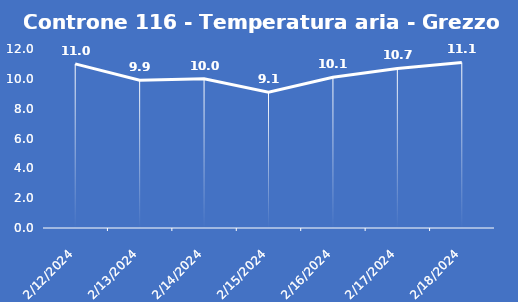
| Category | Controne 116 - Temperatura aria - Grezzo (°C) |
|---|---|
| 2/12/24 | 11 |
| 2/13/24 | 9.9 |
| 2/14/24 | 10 |
| 2/15/24 | 9.1 |
| 2/16/24 | 10.1 |
| 2/17/24 | 10.7 |
| 2/18/24 | 11.1 |